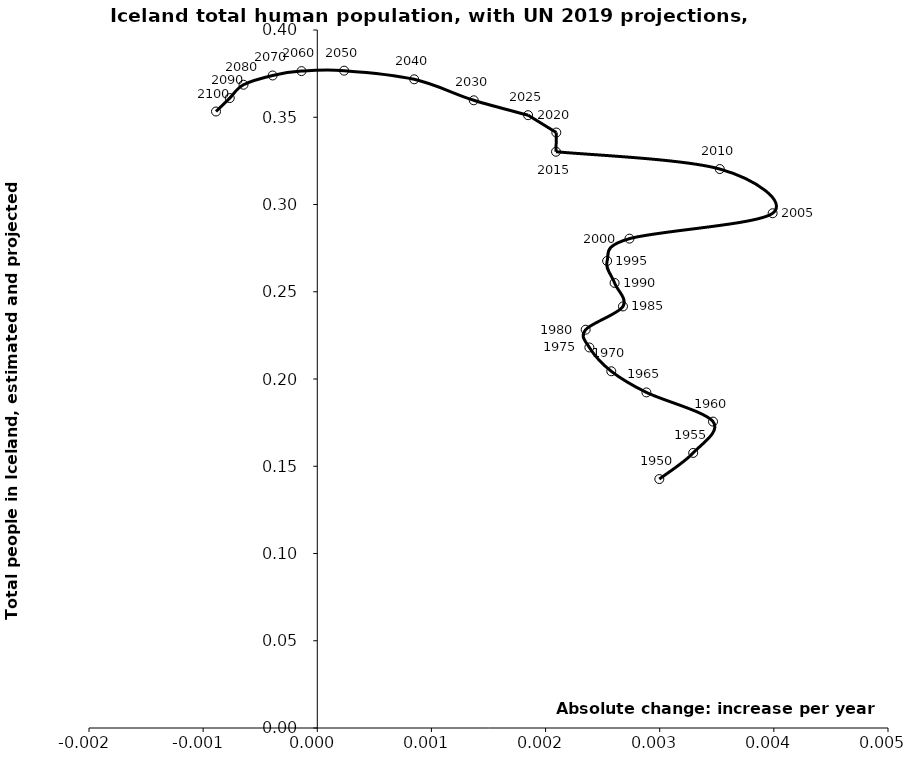
| Category | Series 0 |
|---|---|
| 0.002996599999999994 | 0.143 |
| 0.0032933000000000016 | 0.158 |
| 0.0034670999999999925 | 0.176 |
| 0.0028834000000000025 | 0.192 |
| 0.0025756999999999946 | 0.204 |
| 0.0023835999999999883 | 0.218 |
| 0.0023512000000000116 | 0.228 |
| 0.002678100000000025 | 0.242 |
| 0.0026047000000000097 | 0.255 |
| 0.002539199999999986 | 0.268 |
| 0.002735000000000004 | 0.28 |
| 0.003989300000000001 | 0.295 |
| 0.003526399999999974 | 0.32 |
| 0.002091499999999996 | 0.33 |
| 0.002094100000000021 | 0.341 |
| 0.0018467999999999928 | 0.351 |
| 0.0013708000000000053 | 0.36 |
| 0.0008491000000000026 | 0.372 |
| 0.00023509999999999365 | 0.377 |
| -0.00013835000000000374 | 0.376 |
| -0.0003910499999999928 | 0.374 |
| -0.0006463999999999914 | 0.369 |
| -0.0007668500000000105 | 0.361 |
| -0.0008873000000000296 | 0.353 |